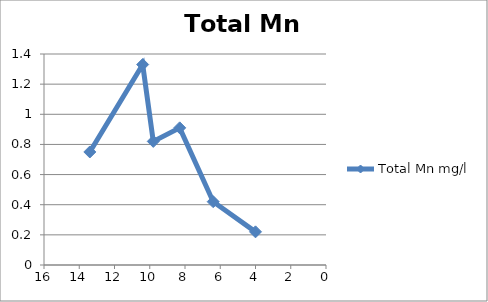
| Category | Total Mn mg/l |
|---|---|
| 13.4 | 0.75 |
| 10.4 | 1.33 |
| 9.8 | 0.82 |
| 8.3 | 0.91 |
| 6.4 | 0.42 |
| 4.0 | 0.22 |